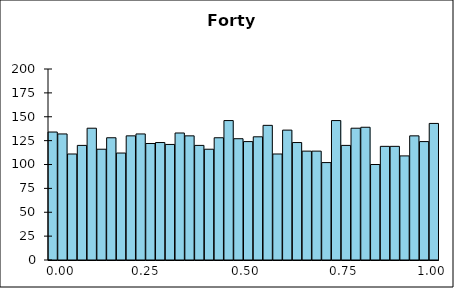
| Category | Series 1 |
|---|---|
| 0 | 134 |
| 1 | 132 |
| 2 | 111 |
| 3 | 120 |
| 4 | 138 |
| 5 | 116 |
| 6 | 128 |
| 7 | 112 |
| 8 | 130 |
| 9 | 132 |
| 10 | 122 |
| 11 | 123 |
| 12 | 121 |
| 13 | 133 |
| 14 | 130 |
| 15 | 120 |
| 16 | 116 |
| 17 | 128 |
| 18 | 146 |
| 19 | 127 |
| 20 | 124 |
| 21 | 129 |
| 22 | 141 |
| 23 | 111 |
| 24 | 136 |
| 25 | 123 |
| 26 | 114 |
| 27 | 114 |
| 28 | 102 |
| 29 | 146 |
| 30 | 120 |
| 31 | 138 |
| 32 | 139 |
| 33 | 100 |
| 34 | 119 |
| 35 | 119 |
| 36 | 109 |
| 37 | 130 |
| 38 | 124 |
| 39 | 143 |